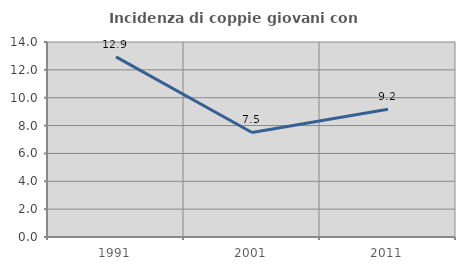
| Category | Incidenza di coppie giovani con figli |
|---|---|
| 1991.0 | 12.929 |
| 2001.0 | 7.505 |
| 2011.0 | 9.176 |